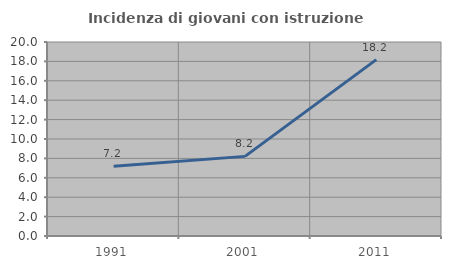
| Category | Incidenza di giovani con istruzione universitaria |
|---|---|
| 1991.0 | 7.2 |
| 2001.0 | 8.209 |
| 2011.0 | 18.182 |